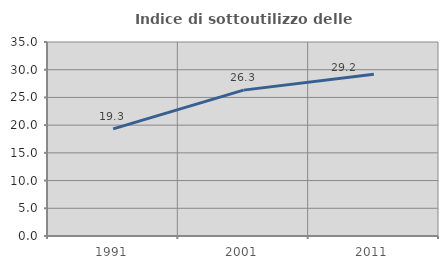
| Category | Indice di sottoutilizzo delle abitazioni  |
|---|---|
| 1991.0 | 19.318 |
| 2001.0 | 26.316 |
| 2011.0 | 29.167 |